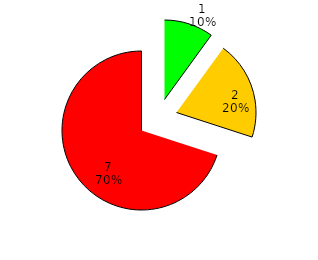
| Category | Series 0 |
|---|---|
| Aceitável | 1 |
| Tolerável | 2 |
| Inaceitavel | 7 |